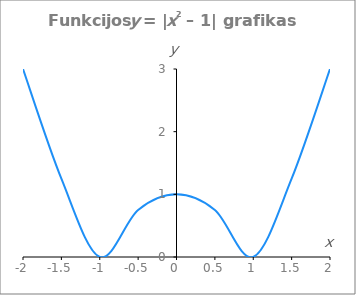
| Category | Series 0 |
|---|---|
| -2.0 | 3 |
| -1.5 | 1.25 |
| -1.0 | 0 |
| -0.5 | 0.75 |
| 0.0 | 1 |
| 0.5 | 0.75 |
| 1.0 | 0 |
| 1.5 | 1.25 |
| 2.0 | 3 |